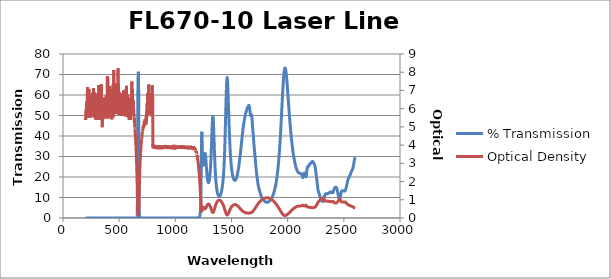
| Category | % Transmission |
|---|---|
| 2600.0 | 29.58 |
| 2599.0 | 29.379 |
| 2598.0 | 29.183 |
| 2597.0 | 28.99 |
| 2596.0 | 28.778 |
| 2595.0 | 28.524 |
| 2594.0 | 28.236 |
| 2593.0 | 27.945 |
| 2592.0 | 27.645 |
| 2591.0 | 27.343 |
| 2590.0 | 27.027 |
| 2589.0 | 26.702 |
| 2588.0 | 26.35 |
| 2587.0 | 26.017 |
| 2586.0 | 25.707 |
| 2585.0 | 25.427 |
| 2584.0 | 25.158 |
| 2583.0 | 24.856 |
| 2582.0 | 24.571 |
| 2581.0 | 24.337 |
| 2580.0 | 24.158 |
| 2579.0 | 24.025 |
| 2578.0 | 23.919 |
| 2577.0 | 23.807 |
| 2576.0 | 23.694 |
| 2575.0 | 23.592 |
| 2574.0 | 23.456 |
| 2573.0 | 23.315 |
| 2572.0 | 23.197 |
| 2571.0 | 23.062 |
| 2570.0 | 22.913 |
| 2569.0 | 22.806 |
| 2568.0 | 22.7 |
| 2567.0 | 22.589 |
| 2566.0 | 22.496 |
| 2565.0 | 22.359 |
| 2564.0 | 22.184 |
| 2563.0 | 22.007 |
| 2562.0 | 21.817 |
| 2561.0 | 21.641 |
| 2560.0 | 21.469 |
| 2559.0 | 21.308 |
| 2558.0 | 21.151 |
| 2557.0 | 21.07 |
| 2556.0 | 20.987 |
| 2555.0 | 20.881 |
| 2554.0 | 20.794 |
| 2553.0 | 20.704 |
| 2552.0 | 20.573 |
| 2551.0 | 20.452 |
| 2550.0 | 20.332 |
| 2549.0 | 20.199 |
| 2548.0 | 20.098 |
| 2547.0 | 19.998 |
| 2546.0 | 19.875 |
| 2545.0 | 19.773 |
| 2544.0 | 19.677 |
| 2543.0 | 19.545 |
| 2542.0 | 19.425 |
| 2541.0 | 19.298 |
| 2540.0 | 19.142 |
| 2539.0 | 18.992 |
| 2538.0 | 18.831 |
| 2537.0 | 18.654 |
| 2536.0 | 18.458 |
| 2535.0 | 18.24 |
| 2534.0 | 17.998 |
| 2533.0 | 17.746 |
| 2532.0 | 17.507 |
| 2531.0 | 17.247 |
| 2530.0 | 17.002 |
| 2529.0 | 16.762 |
| 2528.0 | 16.509 |
| 2527.0 | 16.263 |
| 2526.0 | 16.025 |
| 2525.0 | 15.786 |
| 2524.0 | 15.535 |
| 2523.0 | 15.297 |
| 2522.0 | 15.065 |
| 2521.0 | 14.838 |
| 2520.0 | 14.625 |
| 2519.0 | 14.425 |
| 2518.0 | 14.223 |
| 2517.0 | 14.029 |
| 2516.0 | 13.855 |
| 2515.0 | 13.69 |
| 2514.0 | 13.545 |
| 2513.0 | 13.435 |
| 2512.0 | 13.337 |
| 2511.0 | 13.264 |
| 2510.0 | 13.202 |
| 2509.0 | 13.159 |
| 2508.0 | 13.129 |
| 2507.0 | 13.104 |
| 2506.0 | 13.096 |
| 2505.0 | 13.101 |
| 2504.0 | 13.109 |
| 2503.0 | 13.13 |
| 2502.0 | 13.161 |
| 2501.0 | 13.182 |
| 2500.0 | 13.215 |
| 2499.0 | 13.241 |
| 2498.0 | 13.247 |
| 2497.0 | 13.269 |
| 2496.0 | 13.278 |
| 2495.0 | 13.264 |
| 2494.0 | 13.268 |
| 2493.0 | 13.266 |
| 2492.0 | 13.244 |
| 2491.0 | 13.25 |
| 2490.0 | 13.243 |
| 2489.0 | 13.227 |
| 2488.0 | 13.246 |
| 2487.0 | 13.242 |
| 2486.0 | 13.235 |
| 2485.0 | 13.254 |
| 2484.0 | 13.238 |
| 2483.0 | 13.199 |
| 2482.0 | 13.173 |
| 2481.0 | 13.08 |
| 2480.0 | 12.973 |
| 2479.0 | 12.864 |
| 2478.0 | 12.686 |
| 2477.0 | 12.497 |
| 2476.0 | 12.315 |
| 2475.0 | 12.071 |
| 2474.0 | 11.851 |
| 2473.0 | 11.625 |
| 2472.0 | 11.344 |
| 2471.0 | 11.096 |
| 2470.0 | 10.833 |
| 2469.0 | 10.531 |
| 2468.0 | 10.295 |
| 2467.0 | 10.043 |
| 2466.0 | 9.782 |
| 2465.0 | 9.595 |
| 2464.0 | 9.416 |
| 2463.0 | 9.266 |
| 2462.0 | 9.224 |
| 2461.0 | 9.194 |
| 2460.0 | 9.225 |
| 2459.0 | 9.349 |
| 2458.0 | 9.463 |
| 2457.0 | 9.645 |
| 2456.0 | 9.877 |
| 2455.0 | 10.051 |
| 2454.0 | 10.282 |
| 2453.0 | 10.539 |
| 2452.0 | 10.727 |
| 2451.0 | 11.004 |
| 2450.0 | 11.268 |
| 2449.0 | 11.489 |
| 2448.0 | 11.803 |
| 2447.0 | 12.069 |
| 2446.0 | 12.33 |
| 2445.0 | 12.666 |
| 2444.0 | 12.926 |
| 2443.0 | 13.196 |
| 2442.0 | 13.499 |
| 2441.0 | 13.686 |
| 2440.0 | 13.916 |
| 2439.0 | 14.151 |
| 2438.0 | 14.254 |
| 2437.0 | 14.449 |
| 2436.0 | 14.584 |
| 2435.0 | 14.624 |
| 2434.0 | 14.776 |
| 2433.0 | 14.825 |
| 2432.0 | 14.831 |
| 2431.0 | 14.947 |
| 2430.0 | 14.932 |
| 2429.0 | 14.95 |
| 2428.0 | 15.034 |
| 2427.0 | 14.968 |
| 2426.0 | 14.997 |
| 2425.0 | 15.025 |
| 2424.0 | 14.926 |
| 2423.0 | 14.956 |
| 2422.0 | 14.906 |
| 2421.0 | 14.799 |
| 2420.0 | 14.811 |
| 2419.0 | 14.7 |
| 2418.0 | 14.596 |
| 2417.0 | 14.566 |
| 2416.0 | 14.396 |
| 2415.0 | 14.302 |
| 2414.0 | 14.21 |
| 2413.0 | 14 |
| 2412.0 | 13.893 |
| 2411.0 | 13.72 |
| 2410.0 | 13.495 |
| 2409.0 | 13.386 |
| 2408.0 | 13.161 |
| 2407.0 | 12.971 |
| 2406.0 | 12.865 |
| 2405.0 | 12.651 |
| 2404.0 | 12.558 |
| 2403.0 | 12.481 |
| 2402.0 | 12.357 |
| 2401.0 | 12.365 |
| 2400.0 | 12.332 |
| 2399.0 | 12.295 |
| 2398.0 | 12.364 |
| 2397.0 | 12.34 |
| 2396.0 | 12.369 |
| 2395.0 | 12.434 |
| 2394.0 | 12.403 |
| 2393.0 | 12.463 |
| 2392.0 | 12.484 |
| 2391.0 | 12.47 |
| 2390.0 | 12.54 |
| 2389.0 | 12.528 |
| 2388.0 | 12.545 |
| 2387.0 | 12.614 |
| 2386.0 | 12.595 |
| 2385.0 | 12.657 |
| 2384.0 | 12.687 |
| 2383.0 | 12.674 |
| 2382.0 | 12.744 |
| 2381.0 | 12.726 |
| 2380.0 | 12.722 |
| 2379.0 | 12.749 |
| 2378.0 | 12.68 |
| 2377.0 | 12.673 |
| 2376.0 | 12.631 |
| 2375.0 | 12.545 |
| 2374.0 | 12.532 |
| 2373.0 | 12.446 |
| 2372.0 | 12.38 |
| 2371.0 | 12.352 |
| 2370.0 | 12.259 |
| 2369.0 | 12.23 |
| 2368.0 | 12.177 |
| 2367.0 | 12.103 |
| 2366.0 | 12.097 |
| 2365.0 | 12.037 |
| 2364.0 | 12.021 |
| 2363.0 | 12.029 |
| 2362.0 | 12.003 |
| 2361.0 | 12.036 |
| 2360.0 | 12.032 |
| 2359.0 | 12.02 |
| 2358.0 | 12.04 |
| 2357.0 | 11.988 |
| 2356.0 | 11.971 |
| 2355.0 | 11.938 |
| 2354.0 | 11.861 |
| 2353.0 | 11.845 |
| 2352.0 | 11.785 |
| 2351.0 | 11.758 |
| 2350.0 | 11.768 |
| 2349.0 | 11.74 |
| 2348.0 | 11.777 |
| 2347.0 | 11.793 |
| 2346.0 | 11.804 |
| 2345.0 | 11.857 |
| 2344.0 | 11.849 |
| 2343.0 | 11.878 |
| 2342.0 | 11.889 |
| 2341.0 | 11.857 |
| 2340.0 | 11.875 |
| 2339.0 | 11.81 |
| 2338.0 | 11.77 |
| 2337.0 | 11.729 |
| 2336.0 | 11.616 |
| 2335.0 | 11.564 |
| 2334.0 | 11.434 |
| 2333.0 | 11.307 |
| 2332.0 | 11.216 |
| 2331.0 | 11.033 |
| 2330.0 | 10.925 |
| 2329.0 | 10.767 |
| 2328.0 | 10.589 |
| 2327.0 | 10.459 |
| 2326.0 | 10.239 |
| 2325.0 | 10.068 |
| 2324.0 | 9.864 |
| 2323.0 | 9.6 |
| 2322.0 | 9.405 |
| 2321.0 | 9.104 |
| 2320.0 | 8.871 |
| 2319.0 | 8.654 |
| 2318.0 | 8.404 |
| 2317.0 | 8.287 |
| 2316.0 | 8.129 |
| 2315.0 | 8.051 |
| 2314.0 | 8.036 |
| 2313.0 | 7.991 |
| 2312.0 | 8.062 |
| 2311.0 | 8.076 |
| 2310.0 | 8.129 |
| 2309.0 | 8.218 |
| 2308.0 | 8.235 |
| 2307.0 | 8.325 |
| 2306.0 | 8.347 |
| 2305.0 | 8.384 |
| 2304.0 | 8.449 |
| 2303.0 | 8.457 |
| 2302.0 | 8.539 |
| 2301.0 | 8.592 |
| 2300.0 | 8.661 |
| 2299.0 | 8.773 |
| 2298.0 | 8.863 |
| 2297.0 | 8.999 |
| 2296.0 | 9.125 |
| 2295.0 | 9.265 |
| 2294.0 | 9.418 |
| 2293.0 | 9.566 |
| 2292.0 | 9.726 |
| 2291.0 | 9.889 |
| 2290.0 | 10.055 |
| 2289.0 | 10.24 |
| 2288.0 | 10.425 |
| 2287.0 | 10.612 |
| 2286.0 | 10.807 |
| 2285.0 | 11.007 |
| 2284.0 | 11.198 |
| 2283.0 | 11.392 |
| 2282.0 | 11.583 |
| 2281.0 | 11.737 |
| 2280.0 | 11.899 |
| 2279.0 | 12.035 |
| 2278.0 | 12.156 |
| 2277.0 | 12.3 |
| 2276.0 | 12.413 |
| 2275.0 | 12.583 |
| 2274.0 | 12.741 |
| 2273.0 | 12.949 |
| 2272.0 | 13.212 |
| 2271.0 | 13.476 |
| 2270.0 | 13.857 |
| 2269.0 | 14.218 |
| 2268.0 | 14.633 |
| 2267.0 | 15.074 |
| 2266.0 | 15.491 |
| 2265.0 | 15.971 |
| 2264.0 | 16.408 |
| 2263.0 | 16.91 |
| 2262.0 | 17.372 |
| 2261.0 | 17.826 |
| 2260.0 | 18.316 |
| 2259.0 | 18.766 |
| 2258.0 | 19.248 |
| 2257.0 | 19.728 |
| 2256.0 | 20.213 |
| 2255.0 | 20.685 |
| 2254.0 | 21.143 |
| 2253.0 | 21.618 |
| 2252.0 | 22.054 |
| 2251.0 | 22.505 |
| 2250.0 | 22.939 |
| 2249.0 | 23.334 |
| 2248.0 | 23.718 |
| 2247.0 | 24.073 |
| 2246.0 | 24.41 |
| 2245.0 | 24.711 |
| 2244.0 | 25.001 |
| 2243.0 | 25.26 |
| 2242.0 | 25.484 |
| 2241.0 | 25.685 |
| 2240.0 | 25.863 |
| 2239.0 | 26.015 |
| 2238.0 | 26.154 |
| 2237.0 | 26.274 |
| 2236.0 | 26.369 |
| 2235.0 | 26.468 |
| 2234.0 | 26.553 |
| 2233.0 | 26.641 |
| 2232.0 | 26.729 |
| 2231.0 | 26.827 |
| 2230.0 | 26.928 |
| 2229.0 | 27.03 |
| 2228.0 | 27.136 |
| 2227.0 | 27.235 |
| 2226.0 | 27.332 |
| 2225.0 | 27.412 |
| 2224.0 | 27.484 |
| 2223.0 | 27.532 |
| 2222.0 | 27.566 |
| 2221.0 | 27.571 |
| 2220.0 | 27.566 |
| 2219.0 | 27.538 |
| 2218.0 | 27.493 |
| 2217.0 | 27.439 |
| 2216.0 | 27.373 |
| 2215.0 | 27.309 |
| 2214.0 | 27.22 |
| 2213.0 | 27.163 |
| 2212.0 | 27.077 |
| 2211.0 | 27.016 |
| 2210.0 | 26.955 |
| 2209.0 | 26.896 |
| 2208.0 | 26.859 |
| 2207.0 | 26.798 |
| 2206.0 | 26.782 |
| 2205.0 | 26.722 |
| 2204.0 | 26.708 |
| 2203.0 | 26.663 |
| 2202.0 | 26.626 |
| 2201.0 | 26.588 |
| 2200.0 | 26.519 |
| 2199.0 | 26.477 |
| 2198.0 | 26.368 |
| 2197.0 | 26.314 |
| 2196.0 | 26.18 |
| 2195.0 | 26.086 |
| 2194.0 | 25.951 |
| 2193.0 | 25.817 |
| 2192.0 | 25.703 |
| 2191.0 | 25.562 |
| 2190.0 | 25.497 |
| 2189.0 | 25.381 |
| 2188.0 | 25.356 |
| 2187.0 | 25.305 |
| 2186.0 | 25.302 |
| 2185.0 | 25.3 |
| 2184.0 | 25.299 |
| 2183.0 | 25.313 |
| 2182.0 | 25.288 |
| 2181.0 | 25.275 |
| 2180.0 | 25.218 |
| 2179.0 | 25.148 |
| 2178.0 | 25.04 |
| 2177.0 | 24.901 |
| 2176.0 | 24.728 |
| 2175.0 | 24.514 |
| 2174.0 | 24.252 |
| 2173.0 | 23.929 |
| 2172.0 | 23.564 |
| 2171.0 | 23.152 |
| 2170.0 | 22.693 |
| 2169.0 | 22.205 |
| 2168.0 | 21.725 |
| 2167.0 | 21.251 |
| 2166.0 | 20.824 |
| 2165.0 | 20.5 |
| 2164.0 | 20.255 |
| 2163.0 | 20.11 |
| 2162.0 | 20.067 |
| 2161.0 | 20.11 |
| 2160.0 | 20.243 |
| 2159.0 | 20.42 |
| 2158.0 | 20.63 |
| 2157.0 | 20.865 |
| 2156.0 | 21.101 |
| 2155.0 | 21.32 |
| 2154.0 | 21.528 |
| 2153.0 | 21.691 |
| 2152.0 | 21.819 |
| 2151.0 | 21.903 |
| 2150.0 | 21.945 |
| 2149.0 | 21.947 |
| 2148.0 | 21.896 |
| 2147.0 | 21.812 |
| 2146.0 | 21.684 |
| 2145.0 | 21.516 |
| 2144.0 | 21.325 |
| 2143.0 | 21.1 |
| 2142.0 | 20.865 |
| 2141.0 | 20.604 |
| 2140.0 | 20.355 |
| 2139.0 | 20.138 |
| 2138.0 | 19.944 |
| 2137.0 | 19.799 |
| 2136.0 | 19.724 |
| 2135.0 | 19.717 |
| 2134.0 | 19.788 |
| 2133.0 | 19.922 |
| 2132.0 | 20.105 |
| 2131.0 | 20.325 |
| 2130.0 | 20.554 |
| 2129.0 | 20.775 |
| 2128.0 | 20.976 |
| 2127.0 | 21.146 |
| 2126.0 | 21.277 |
| 2125.0 | 21.369 |
| 2124.0 | 21.442 |
| 2123.0 | 21.486 |
| 2122.0 | 21.517 |
| 2121.0 | 21.544 |
| 2120.0 | 21.566 |
| 2119.0 | 21.596 |
| 2118.0 | 21.615 |
| 2117.0 | 21.643 |
| 2116.0 | 21.666 |
| 2115.0 | 21.694 |
| 2114.0 | 21.711 |
| 2113.0 | 21.731 |
| 2112.0 | 21.744 |
| 2111.0 | 21.763 |
| 2110.0 | 21.78 |
| 2109.0 | 21.799 |
| 2108.0 | 21.822 |
| 2107.0 | 21.844 |
| 2106.0 | 21.867 |
| 2105.0 | 21.893 |
| 2104.0 | 21.917 |
| 2103.0 | 21.947 |
| 2102.0 | 21.974 |
| 2101.0 | 22.002 |
| 2100.0 | 22.034 |
| 2099.0 | 22.069 |
| 2098.0 | 22.107 |
| 2097.0 | 22.147 |
| 2096.0 | 22.194 |
| 2095.0 | 22.248 |
| 2094.0 | 22.302 |
| 2093.0 | 22.362 |
| 2092.0 | 22.426 |
| 2091.0 | 22.495 |
| 2090.0 | 22.576 |
| 2089.0 | 22.66 |
| 2088.0 | 22.748 |
| 2087.0 | 22.843 |
| 2086.0 | 22.945 |
| 2085.0 | 23.056 |
| 2084.0 | 23.175 |
| 2083.0 | 23.301 |
| 2082.0 | 23.438 |
| 2081.0 | 23.574 |
| 2080.0 | 23.725 |
| 2079.0 | 23.882 |
| 2078.0 | 24.043 |
| 2077.0 | 24.22 |
| 2076.0 | 24.406 |
| 2075.0 | 24.587 |
| 2074.0 | 24.782 |
| 2073.0 | 24.982 |
| 2072.0 | 25.189 |
| 2071.0 | 25.403 |
| 2070.0 | 25.632 |
| 2069.0 | 25.862 |
| 2068.0 | 26.088 |
| 2067.0 | 26.331 |
| 2066.0 | 26.579 |
| 2065.0 | 26.824 |
| 2064.0 | 27.098 |
| 2063.0 | 27.367 |
| 2062.0 | 27.634 |
| 2061.0 | 27.909 |
| 2060.0 | 28.197 |
| 2059.0 | 28.477 |
| 2058.0 | 28.782 |
| 2057.0 | 29.093 |
| 2056.0 | 29.4 |
| 2055.0 | 29.709 |
| 2054.0 | 30.031 |
| 2053.0 | 30.364 |
| 2052.0 | 30.7 |
| 2051.0 | 31.057 |
| 2050.0 | 31.428 |
| 2049.0 | 31.78 |
| 2048.0 | 32.163 |
| 2047.0 | 32.543 |
| 2046.0 | 32.93 |
| 2045.0 | 33.341 |
| 2044.0 | 33.767 |
| 2043.0 | 34.193 |
| 2042.0 | 34.619 |
| 2041.0 | 35.062 |
| 2040.0 | 35.522 |
| 2039.0 | 35.989 |
| 2038.0 | 36.484 |
| 2037.0 | 36.981 |
| 2036.0 | 37.479 |
| 2035.0 | 37.987 |
| 2034.0 | 38.519 |
| 2033.0 | 39.05 |
| 2032.0 | 39.613 |
| 2031.0 | 40.181 |
| 2030.0 | 40.736 |
| 2029.0 | 41.313 |
| 2028.0 | 41.893 |
| 2027.0 | 42.488 |
| 2026.0 | 43.101 |
| 2025.0 | 43.726 |
| 2024.0 | 44.365 |
| 2023.0 | 44.972 |
| 2022.0 | 45.626 |
| 2021.0 | 46.265 |
| 2020.0 | 46.926 |
| 2019.0 | 47.604 |
| 2018.0 | 48.296 |
| 2017.0 | 48.973 |
| 2016.0 | 49.664 |
| 2015.0 | 50.378 |
| 2014.0 | 51.082 |
| 2013.0 | 51.823 |
| 2012.0 | 52.583 |
| 2011.0 | 53.322 |
| 2010.0 | 54.077 |
| 2009.0 | 54.83 |
| 2008.0 | 55.605 |
| 2007.0 | 56.371 |
| 2006.0 | 57.178 |
| 2005.0 | 57.975 |
| 2004.0 | 58.749 |
| 2003.0 | 59.527 |
| 2002.0 | 60.309 |
| 2001.0 | 61.057 |
| 2000.0 | 61.853 |
| 1999.0 | 62.61 |
| 1998.0 | 63.377 |
| 1997.0 | 64.103 |
| 1996.0 | 64.838 |
| 1995.0 | 65.545 |
| 1994.0 | 66.245 |
| 1993.0 | 66.949 |
| 1992.0 | 67.612 |
| 1991.0 | 68.251 |
| 1990.0 | 68.865 |
| 1989.0 | 69.451 |
| 1988.0 | 69.986 |
| 1987.0 | 70.53 |
| 1986.0 | 71.016 |
| 1985.0 | 71.437 |
| 1984.0 | 71.839 |
| 1983.0 | 72.171 |
| 1982.0 | 72.473 |
| 1981.0 | 72.732 |
| 1980.0 | 72.926 |
| 1979.0 | 73.088 |
| 1978.0 | 73.164 |
| 1977.0 | 73.227 |
| 1976.0 | 73.19 |
| 1975.0 | 73.134 |
| 1974.0 | 72.991 |
| 1973.0 | 72.804 |
| 1972.0 | 72.55 |
| 1971.0 | 72.258 |
| 1970.0 | 71.889 |
| 1969.0 | 71.492 |
| 1968.0 | 71.016 |
| 1967.0 | 70.476 |
| 1966.0 | 69.924 |
| 1965.0 | 69.288 |
| 1964.0 | 68.644 |
| 1963.0 | 67.898 |
| 1962.0 | 67.173 |
| 1961.0 | 66.306 |
| 1960.0 | 65.463 |
| 1959.0 | 64.599 |
| 1958.0 | 63.686 |
| 1957.0 | 62.742 |
| 1956.0 | 61.776 |
| 1955.0 | 60.773 |
| 1954.0 | 59.713 |
| 1953.0 | 58.688 |
| 1952.0 | 57.636 |
| 1951.0 | 56.591 |
| 1950.0 | 55.525 |
| 1949.0 | 54.458 |
| 1948.0 | 53.33 |
| 1947.0 | 52.238 |
| 1946.0 | 51.172 |
| 1945.0 | 50.076 |
| 1944.0 | 48.991 |
| 1943.0 | 47.926 |
| 1942.0 | 46.864 |
| 1941.0 | 45.801 |
| 1940.0 | 44.791 |
| 1939.0 | 43.737 |
| 1938.0 | 42.739 |
| 1937.0 | 41.752 |
| 1936.0 | 40.781 |
| 1935.0 | 39.81 |
| 1934.0 | 38.841 |
| 1933.0 | 37.963 |
| 1932.0 | 37.062 |
| 1931.0 | 36.201 |
| 1930.0 | 35.347 |
| 1929.0 | 34.465 |
| 1928.0 | 33.62 |
| 1927.0 | 32.816 |
| 1926.0 | 32.093 |
| 1925.0 | 31.378 |
| 1924.0 | 30.666 |
| 1923.0 | 29.965 |
| 1922.0 | 29.295 |
| 1921.0 | 28.635 |
| 1920.0 | 27.901 |
| 1919.0 | 27.192 |
| 1918.0 | 26.567 |
| 1917.0 | 26.025 |
| 1916.0 | 25.469 |
| 1915.0 | 24.901 |
| 1914.0 | 24.372 |
| 1913.0 | 23.817 |
| 1912.0 | 23.271 |
| 1911.0 | 22.751 |
| 1910.0 | 22.257 |
| 1909.0 | 21.815 |
| 1908.0 | 21.414 |
| 1907.0 | 21.019 |
| 1906.0 | 20.552 |
| 1905.0 | 20.113 |
| 1904.0 | 19.662 |
| 1903.0 | 19.263 |
| 1902.0 | 18.911 |
| 1901.0 | 18.563 |
| 1900.0 | 18.208 |
| 1899.0 | 17.843 |
| 1898.0 | 17.488 |
| 1897.0 | 17.16 |
| 1896.0 | 16.873 |
| 1895.0 | 16.6 |
| 1894.0 | 16.317 |
| 1893.0 | 16.019 |
| 1892.0 | 15.75 |
| 1891.0 | 15.471 |
| 1890.0 | 15.204 |
| 1889.0 | 14.943 |
| 1888.0 | 14.707 |
| 1887.0 | 14.472 |
| 1886.0 | 14.236 |
| 1885.0 | 13.999 |
| 1884.0 | 13.753 |
| 1883.0 | 13.528 |
| 1882.0 | 13.324 |
| 1881.0 | 13.125 |
| 1880.0 | 12.922 |
| 1879.0 | 12.737 |
| 1878.0 | 12.541 |
| 1877.0 | 12.35 |
| 1876.0 | 12.161 |
| 1875.0 | 11.996 |
| 1874.0 | 11.837 |
| 1873.0 | 11.687 |
| 1872.0 | 11.515 |
| 1871.0 | 11.34 |
| 1870.0 | 11.193 |
| 1869.0 | 11.052 |
| 1868.0 | 10.901 |
| 1867.0 | 10.759 |
| 1866.0 | 10.629 |
| 1865.0 | 10.507 |
| 1864.0 | 10.383 |
| 1863.0 | 10.259 |
| 1862.0 | 10.153 |
| 1861.0 | 10.048 |
| 1860.0 | 9.931 |
| 1859.0 | 9.82 |
| 1858.0 | 9.711 |
| 1857.0 | 9.617 |
| 1856.0 | 9.52 |
| 1855.0 | 9.42 |
| 1854.0 | 9.323 |
| 1853.0 | 9.223 |
| 1852.0 | 9.134 |
| 1851.0 | 9.055 |
| 1850.0 | 8.987 |
| 1849.0 | 8.92 |
| 1848.0 | 8.839 |
| 1847.0 | 8.751 |
| 1846.0 | 8.671 |
| 1845.0 | 8.606 |
| 1844.0 | 8.551 |
| 1843.0 | 8.496 |
| 1842.0 | 8.434 |
| 1841.0 | 8.365 |
| 1840.0 | 8.302 |
| 1839.0 | 8.247 |
| 1838.0 | 8.204 |
| 1837.0 | 8.159 |
| 1836.0 | 8.107 |
| 1835.0 | 8.061 |
| 1834.0 | 8.022 |
| 1833.0 | 7.99 |
| 1832.0 | 7.958 |
| 1831.0 | 7.922 |
| 1830.0 | 7.885 |
| 1829.0 | 7.845 |
| 1828.0 | 7.826 |
| 1827.0 | 7.804 |
| 1826.0 | 7.79 |
| 1825.0 | 7.767 |
| 1824.0 | 7.748 |
| 1823.0 | 7.73 |
| 1822.0 | 7.719 |
| 1821.0 | 7.71 |
| 1820.0 | 7.701 |
| 1819.0 | 7.704 |
| 1818.0 | 7.696 |
| 1817.0 | 7.698 |
| 1816.0 | 7.698 |
| 1815.0 | 7.695 |
| 1814.0 | 7.703 |
| 1813.0 | 7.705 |
| 1812.0 | 7.708 |
| 1811.0 | 7.725 |
| 1810.0 | 7.738 |
| 1809.0 | 7.752 |
| 1808.0 | 7.77 |
| 1807.0 | 7.787 |
| 1806.0 | 7.812 |
| 1805.0 | 7.834 |
| 1804.0 | 7.854 |
| 1803.0 | 7.884 |
| 1802.0 | 7.912 |
| 1801.0 | 7.94 |
| 1800.0 | 7.978 |
| 1799.0 | 8.01 |
| 1798.0 | 8.044 |
| 1797.0 | 8.087 |
| 1796.0 | 8.127 |
| 1795.0 | 8.167 |
| 1794.0 | 8.219 |
| 1793.0 | 8.264 |
| 1792.0 | 8.307 |
| 1791.0 | 8.366 |
| 1790.0 | 8.417 |
| 1789.0 | 8.47 |
| 1788.0 | 8.534 |
| 1787.0 | 8.593 |
| 1786.0 | 8.652 |
| 1785.0 | 8.723 |
| 1784.0 | 8.788 |
| 1783.0 | 8.851 |
| 1782.0 | 8.931 |
| 1781.0 | 8.999 |
| 1780.0 | 9.071 |
| 1779.0 | 9.146 |
| 1778.0 | 9.217 |
| 1777.0 | 9.292 |
| 1776.0 | 9.376 |
| 1775.0 | 9.456 |
| 1774.0 | 9.541 |
| 1773.0 | 9.632 |
| 1772.0 | 9.722 |
| 1771.0 | 9.816 |
| 1770.0 | 9.927 |
| 1769.0 | 10.042 |
| 1768.0 | 10.162 |
| 1767.0 | 10.298 |
| 1766.0 | 10.433 |
| 1765.0 | 10.573 |
| 1764.0 | 10.728 |
| 1763.0 | 10.885 |
| 1762.0 | 11.048 |
| 1761.0 | 11.216 |
| 1760.0 | 11.384 |
| 1759.0 | 11.556 |
| 1758.0 | 11.733 |
| 1757.0 | 11.913 |
| 1756.0 | 12.092 |
| 1755.0 | 12.274 |
| 1754.0 | 12.462 |
| 1753.0 | 12.639 |
| 1752.0 | 12.82 |
| 1751.0 | 13.015 |
| 1750.0 | 13.212 |
| 1749.0 | 13.408 |
| 1748.0 | 13.618 |
| 1747.0 | 13.822 |
| 1746.0 | 14.027 |
| 1745.0 | 14.241 |
| 1744.0 | 14.457 |
| 1743.0 | 14.677 |
| 1742.0 | 14.907 |
| 1741.0 | 15.146 |
| 1740.0 | 15.402 |
| 1739.0 | 15.666 |
| 1738.0 | 15.954 |
| 1737.0 | 16.262 |
| 1736.0 | 16.581 |
| 1735.0 | 16.916 |
| 1734.0 | 17.265 |
| 1733.0 | 17.631 |
| 1732.0 | 18.012 |
| 1731.0 | 18.416 |
| 1730.0 | 18.838 |
| 1729.0 | 19.25 |
| 1728.0 | 19.675 |
| 1727.0 | 20.104 |
| 1726.0 | 20.531 |
| 1725.0 | 20.964 |
| 1724.0 | 21.438 |
| 1723.0 | 21.922 |
| 1722.0 | 22.393 |
| 1721.0 | 22.926 |
| 1720.0 | 23.472 |
| 1719.0 | 24.038 |
| 1718.0 | 24.641 |
| 1717.0 | 25.28 |
| 1716.0 | 25.915 |
| 1715.0 | 26.537 |
| 1714.0 | 27.187 |
| 1713.0 | 27.817 |
| 1712.0 | 28.435 |
| 1711.0 | 29.07 |
| 1710.0 | 29.685 |
| 1709.0 | 30.277 |
| 1708.0 | 30.863 |
| 1707.0 | 31.459 |
| 1706.0 | 32.034 |
| 1705.0 | 32.639 |
| 1704.0 | 33.242 |
| 1703.0 | 33.812 |
| 1702.0 | 34.402 |
| 1701.0 | 35.013 |
| 1700.0 | 35.682 |
| 1699.0 | 36.394 |
| 1698.0 | 37.205 |
| 1697.0 | 38.061 |
| 1696.0 | 38.869 |
| 1695.0 | 39.673 |
| 1694.0 | 40.442 |
| 1693.0 | 41.127 |
| 1692.0 | 41.762 |
| 1691.0 | 42.333 |
| 1690.0 | 42.913 |
| 1689.0 | 43.515 |
| 1688.0 | 44.151 |
| 1687.0 | 44.859 |
| 1686.0 | 45.656 |
| 1685.0 | 46.497 |
| 1684.0 | 47.27 |
| 1683.0 | 48.017 |
| 1682.0 | 48.725 |
| 1681.0 | 49.32 |
| 1680.0 | 49.736 |
| 1679.0 | 50.06 |
| 1678.0 | 50.286 |
| 1677.0 | 50.379 |
| 1676.0 | 50.327 |
| 1675.0 | 50.243 |
| 1674.0 | 50.177 |
| 1673.0 | 50.091 |
| 1672.0 | 49.978 |
| 1671.0 | 49.927 |
| 1670.0 | 50.02 |
| 1669.0 | 50.199 |
| 1668.0 | 50.415 |
| 1667.0 | 50.776 |
| 1666.0 | 51.315 |
| 1665.0 | 51.908 |
| 1664.0 | 52.417 |
| 1663.0 | 52.909 |
| 1662.0 | 53.44 |
| 1661.0 | 53.908 |
| 1660.0 | 54.246 |
| 1659.0 | 54.463 |
| 1658.0 | 54.665 |
| 1657.0 | 54.872 |
| 1656.0 | 54.96 |
| 1655.0 | 54.924 |
| 1654.0 | 54.888 |
| 1653.0 | 54.891 |
| 1652.0 | 54.849 |
| 1651.0 | 54.678 |
| 1650.0 | 54.47 |
| 1649.0 | 54.362 |
| 1648.0 | 54.291 |
| 1647.0 | 54.172 |
| 1646.0 | 54.011 |
| 1645.0 | 53.923 |
| 1644.0 | 53.934 |
| 1643.0 | 53.932 |
| 1642.0 | 53.805 |
| 1641.0 | 53.647 |
| 1640.0 | 53.528 |
| 1639.0 | 53.464 |
| 1638.0 | 53.308 |
| 1637.0 | 53.048 |
| 1636.0 | 52.805 |
| 1635.0 | 52.667 |
| 1634.0 | 52.54 |
| 1633.0 | 52.359 |
| 1632.0 | 52.107 |
| 1631.0 | 51.892 |
| 1630.0 | 51.766 |
| 1629.0 | 51.66 |
| 1628.0 | 51.437 |
| 1627.0 | 51.147 |
| 1626.0 | 50.889 |
| 1625.0 | 50.721 |
| 1624.0 | 50.532 |
| 1623.0 | 50.255 |
| 1622.0 | 49.909 |
| 1621.0 | 49.592 |
| 1620.0 | 49.364 |
| 1619.0 | 49.157 |
| 1618.0 | 48.875 |
| 1617.0 | 48.533 |
| 1616.0 | 48.211 |
| 1615.0 | 47.95 |
| 1614.0 | 47.714 |
| 1613.0 | 47.444 |
| 1612.0 | 47.057 |
| 1611.0 | 46.664 |
| 1610.0 | 46.325 |
| 1609.0 | 46.012 |
| 1608.0 | 45.677 |
| 1607.0 | 45.263 |
| 1606.0 | 44.796 |
| 1605.0 | 44.362 |
| 1604.0 | 43.987 |
| 1603.0 | 43.611 |
| 1602.0 | 43.175 |
| 1601.0 | 42.673 |
| 1600.0 | 42.157 |
| 1599.0 | 41.685 |
| 1598.0 | 41.249 |
| 1597.0 | 40.823 |
| 1596.0 | 40.295 |
| 1595.0 | 39.743 |
| 1594.0 | 39.195 |
| 1593.0 | 38.683 |
| 1592.0 | 38.207 |
| 1591.0 | 37.699 |
| 1590.0 | 37.163 |
| 1589.0 | 36.587 |
| 1588.0 | 36.012 |
| 1587.0 | 35.497 |
| 1586.0 | 35.003 |
| 1585.0 | 34.52 |
| 1584.0 | 34.004 |
| 1583.0 | 33.455 |
| 1582.0 | 32.915 |
| 1581.0 | 32.406 |
| 1580.0 | 31.928 |
| 1579.0 | 31.473 |
| 1578.0 | 31.016 |
| 1577.0 | 30.509 |
| 1576.0 | 30 |
| 1575.0 | 29.512 |
| 1574.0 | 29.049 |
| 1573.0 | 28.616 |
| 1572.0 | 28.193 |
| 1571.0 | 27.767 |
| 1570.0 | 27.313 |
| 1569.0 | 26.872 |
| 1568.0 | 26.452 |
| 1567.0 | 26.044 |
| 1566.0 | 25.67 |
| 1565.0 | 25.318 |
| 1564.0 | 24.946 |
| 1563.0 | 24.576 |
| 1562.0 | 24.215 |
| 1561.0 | 23.863 |
| 1560.0 | 23.52 |
| 1559.0 | 23.212 |
| 1558.0 | 22.907 |
| 1557.0 | 22.603 |
| 1556.0 | 22.32 |
| 1555.0 | 22.02 |
| 1554.0 | 21.733 |
| 1553.0 | 21.451 |
| 1552.0 | 21.191 |
| 1551.0 | 20.939 |
| 1550.0 | 20.698 |
| 1549.0 | 20.493 |
| 1548.0 | 20.273 |
| 1547.0 | 20.063 |
| 1546.0 | 19.859 |
| 1545.0 | 19.664 |
| 1544.0 | 19.491 |
| 1543.0 | 19.338 |
| 1542.0 | 19.205 |
| 1541.0 | 19.077 |
| 1540.0 | 18.965 |
| 1539.0 | 18.853 |
| 1538.0 | 18.748 |
| 1537.0 | 18.65 |
| 1536.0 | 18.564 |
| 1535.0 | 18.496 |
| 1534.0 | 18.446 |
| 1533.0 | 18.415 |
| 1532.0 | 18.394 |
| 1531.0 | 18.385 |
| 1530.0 | 18.389 |
| 1529.0 | 18.398 |
| 1528.0 | 18.412 |
| 1527.0 | 18.436 |
| 1526.0 | 18.467 |
| 1525.0 | 18.514 |
| 1524.0 | 18.574 |
| 1523.0 | 18.645 |
| 1522.0 | 18.734 |
| 1521.0 | 18.835 |
| 1520.0 | 18.946 |
| 1519.0 | 19.075 |
| 1518.0 | 19.213 |
| 1517.0 | 19.361 |
| 1516.0 | 19.518 |
| 1515.0 | 19.69 |
| 1514.0 | 19.875 |
| 1513.0 | 20.088 |
| 1512.0 | 20.312 |
| 1511.0 | 20.545 |
| 1510.0 | 20.799 |
| 1509.0 | 21.075 |
| 1508.0 | 21.369 |
| 1507.0 | 21.683 |
| 1506.0 | 22.028 |
| 1505.0 | 22.39 |
| 1504.0 | 22.753 |
| 1503.0 | 23.155 |
| 1502.0 | 23.582 |
| 1501.0 | 24.028 |
| 1500.0 | 24.521 |
| 1499.0 | 25.036 |
| 1498.0 | 25.575 |
| 1497.0 | 26.148 |
| 1496.0 | 26.769 |
| 1495.0 | 27.403 |
| 1494.0 | 28.103 |
| 1493.0 | 28.843 |
| 1492.0 | 29.599 |
| 1491.0 | 30.417 |
| 1490.0 | 31.281 |
| 1489.0 | 32.202 |
| 1488.0 | 33.165 |
| 1487.0 | 34.225 |
| 1486.0 | 35.337 |
| 1485.0 | 36.45 |
| 1484.0 | 37.674 |
| 1483.0 | 38.928 |
| 1482.0 | 40.241 |
| 1481.0 | 41.668 |
| 1480.0 | 43.16 |
| 1479.0 | 44.662 |
| 1478.0 | 46.217 |
| 1477.0 | 47.837 |
| 1476.0 | 49.5 |
| 1475.0 | 51.222 |
| 1474.0 | 53.006 |
| 1473.0 | 54.732 |
| 1472.0 | 56.489 |
| 1471.0 | 58.185 |
| 1470.0 | 59.872 |
| 1469.0 | 61.451 |
| 1468.0 | 62.996 |
| 1467.0 | 64.406 |
| 1466.0 | 65.599 |
| 1465.0 | 66.656 |
| 1464.0 | 67.492 |
| 1463.0 | 68.083 |
| 1462.0 | 68.446 |
| 1461.0 | 68.531 |
| 1460.0 | 68.328 |
| 1459.0 | 67.876 |
| 1458.0 | 67.145 |
| 1457.0 | 66.161 |
| 1456.0 | 64.924 |
| 1455.0 | 63.409 |
| 1454.0 | 61.76 |
| 1453.0 | 60.003 |
| 1452.0 | 58.091 |
| 1451.0 | 56.092 |
| 1450.0 | 54.044 |
| 1449.0 | 51.877 |
| 1448.0 | 49.729 |
| 1447.0 | 47.692 |
| 1446.0 | 45.635 |
| 1445.0 | 43.573 |
| 1444.0 | 41.619 |
| 1443.0 | 39.723 |
| 1442.0 | 37.838 |
| 1441.0 | 36.053 |
| 1440.0 | 34.451 |
| 1439.0 | 32.844 |
| 1438.0 | 31.374 |
| 1437.0 | 29.944 |
| 1436.0 | 28.572 |
| 1435.0 | 27.309 |
| 1434.0 | 26.136 |
| 1433.0 | 25.032 |
| 1432.0 | 23.99 |
| 1431.0 | 23.027 |
| 1430.0 | 22.113 |
| 1429.0 | 21.255 |
| 1428.0 | 20.501 |
| 1427.0 | 19.765 |
| 1426.0 | 19.112 |
| 1425.0 | 18.494 |
| 1424.0 | 17.929 |
| 1423.0 | 17.382 |
| 1422.0 | 16.89 |
| 1421.0 | 16.452 |
| 1420.0 | 16.028 |
| 1419.0 | 15.618 |
| 1418.0 | 15.236 |
| 1417.0 | 14.874 |
| 1416.0 | 14.529 |
| 1415.0 | 14.218 |
| 1414.0 | 13.9 |
| 1413.0 | 13.603 |
| 1412.0 | 13.335 |
| 1411.0 | 13.063 |
| 1410.0 | 12.815 |
| 1409.0 | 12.569 |
| 1408.0 | 12.352 |
| 1407.0 | 12.149 |
| 1406.0 | 11.946 |
| 1405.0 | 11.772 |
| 1404.0 | 11.584 |
| 1403.0 | 11.441 |
| 1402.0 | 11.313 |
| 1401.0 | 11.197 |
| 1400.0 | 11.072 |
| 1399.0 | 10.955 |
| 1398.0 | 10.857 |
| 1397.0 | 10.774 |
| 1396.0 | 10.693 |
| 1395.0 | 10.62 |
| 1394.0 | 10.574 |
| 1393.0 | 10.548 |
| 1392.0 | 10.529 |
| 1391.0 | 10.516 |
| 1390.0 | 10.521 |
| 1389.0 | 10.541 |
| 1388.0 | 10.573 |
| 1387.0 | 10.624 |
| 1386.0 | 10.67 |
| 1385.0 | 10.742 |
| 1384.0 | 10.809 |
| 1383.0 | 10.88 |
| 1382.0 | 11.005 |
| 1381.0 | 11.105 |
| 1380.0 | 11.238 |
| 1379.0 | 11.37 |
| 1378.0 | 11.53 |
| 1377.0 | 11.706 |
| 1376.0 | 11.906 |
| 1375.0 | 12.124 |
| 1374.0 | 12.381 |
| 1373.0 | 12.654 |
| 1372.0 | 12.957 |
| 1371.0 | 13.305 |
| 1370.0 | 13.68 |
| 1369.0 | 14.024 |
| 1368.0 | 14.392 |
| 1367.0 | 14.848 |
| 1366.0 | 15.31 |
| 1365.0 | 15.819 |
| 1364.0 | 16.377 |
| 1363.0 | 16.884 |
| 1362.0 | 17.465 |
| 1361.0 | 18.22 |
| 1360.0 | 18.919 |
| 1359.0 | 19.719 |
| 1358.0 | 20.578 |
| 1357.0 | 21.456 |
| 1356.0 | 22.457 |
| 1355.0 | 23.503 |
| 1354.0 | 24.619 |
| 1353.0 | 25.779 |
| 1352.0 | 27.055 |
| 1351.0 | 28.323 |
| 1350.0 | 29.697 |
| 1349.0 | 31.133 |
| 1348.0 | 32.575 |
| 1347.0 | 34.187 |
| 1346.0 | 35.825 |
| 1345.0 | 37.451 |
| 1344.0 | 39.144 |
| 1343.0 | 40.798 |
| 1342.0 | 42.382 |
| 1341.0 | 43.901 |
| 1340.0 | 45.356 |
| 1339.0 | 46.661 |
| 1338.0 | 47.716 |
| 1337.0 | 48.565 |
| 1336.0 | 49.143 |
| 1335.0 | 49.461 |
| 1334.0 | 49.536 |
| 1333.0 | 49.338 |
| 1332.0 | 48.857 |
| 1331.0 | 48.125 |
| 1330.0 | 47.162 |
| 1329.0 | 46.071 |
| 1328.0 | 44.809 |
| 1327.0 | 43.407 |
| 1326.0 | 41.962 |
| 1325.0 | 40.445 |
| 1324.0 | 38.929 |
| 1323.0 | 37.403 |
| 1322.0 | 35.892 |
| 1321.0 | 34.344 |
| 1320.0 | 32.85 |
| 1319.0 | 31.516 |
| 1318.0 | 30.185 |
| 1317.0 | 28.943 |
| 1316.0 | 27.77 |
| 1315.0 | 26.636 |
| 1314.0 | 25.613 |
| 1313.0 | 24.682 |
| 1312.0 | 23.825 |
| 1311.0 | 23.016 |
| 1310.0 | 22.303 |
| 1309.0 | 21.631 |
| 1308.0 | 20.995 |
| 1307.0 | 20.426 |
| 1306.0 | 19.904 |
| 1305.0 | 19.43 |
| 1304.0 | 18.993 |
| 1303.0 | 18.605 |
| 1302.0 | 18.254 |
| 1301.0 | 17.969 |
| 1300.0 | 17.741 |
| 1299.0 | 17.552 |
| 1298.0 | 17.421 |
| 1297.0 | 17.328 |
| 1296.0 | 17.275 |
| 1295.0 | 17.257 |
| 1294.0 | 17.282 |
| 1293.0 | 17.341 |
| 1292.0 | 17.437 |
| 1291.0 | 17.567 |
| 1290.0 | 17.752 |
| 1289.0 | 17.988 |
| 1288.0 | 18.263 |
| 1287.0 | 18.587 |
| 1286.0 | 18.96 |
| 1285.0 | 19.386 |
| 1284.0 | 19.839 |
| 1283.0 | 20.366 |
| 1282.0 | 20.936 |
| 1281.0 | 21.521 |
| 1280.0 | 22.181 |
| 1279.0 | 22.868 |
| 1278.0 | 23.597 |
| 1277.0 | 24.369 |
| 1276.0 | 25.177 |
| 1275.0 | 25.987 |
| 1274.0 | 26.77 |
| 1273.0 | 27.575 |
| 1272.0 | 28.332 |
| 1271.0 | 29.053 |
| 1270.0 | 29.736 |
| 1269.0 | 30.321 |
| 1268.0 | 30.792 |
| 1267.0 | 31.151 |
| 1266.0 | 31.396 |
| 1265.0 | 31.506 |
| 1264.0 | 31.491 |
| 1263.0 | 31.367 |
| 1262.0 | 31.152 |
| 1261.0 | 30.842 |
| 1260.0 | 30.466 |
| 1259.0 | 30.028 |
| 1258.0 | 29.526 |
| 1257.0 | 28.979 |
| 1256.0 | 28.409 |
| 1255.0 | 27.868 |
| 1254.0 | 27.325 |
| 1253.0 | 26.835 |
| 1252.0 | 26.409 |
| 1251.0 | 26.061 |
| 1250.0 | 25.825 |
| 1249.0 | 25.709 |
| 1248.0 | 25.728 |
| 1247.0 | 25.896 |
| 1246.0 | 26.233 |
| 1245.0 | 26.805 |
| 1244.0 | 27.634 |
| 1243.0 | 28.71 |
| 1242.0 | 30.155 |
| 1241.0 | 31.946 |
| 1240.0 | 34.088 |
| 1239.0 | 36.488 |
| 1238.0 | 38.973 |
| 1237.0 | 41.029 |
| 1236.0 | 42.113 |
| 1235.0 | 41.833 |
| 1234.0 | 39.896 |
| 1233.0 | 36.464 |
| 1232.0 | 31.748 |
| 1231.0 | 26.617 |
| 1230.0 | 21.62 |
| 1229.0 | 17.116 |
| 1228.0 | 13.225 |
| 1227.0 | 10.168 |
| 1226.0 | 7.67 |
| 1225.0 | 5.787 |
| 1224.0 | 4.432 |
| 1223.0 | 3.403 |
| 1222.0 | 2.642 |
| 1221.0 | 2.065 |
| 1220.0 | 1.636 |
| 1219.0 | 1.296 |
| 1218.0 | 1.038 |
| 1217.0 | 0.85 |
| 1216.0 | 0.694 |
| 1215.0 | 0.571 |
| 1214.0 | 0.473 |
| 1213.0 | 0.396 |
| 1212.0 | 0.329 |
| 1211.0 | 0.281 |
| 1210.0 | 0.241 |
| 1209.0 | 0.203 |
| 1208.0 | 0.179 |
| 1207.0 | 0.152 |
| 1206.0 | 0.132 |
| 1205.0 | 0.116 |
| 1204.0 | 0.105 |
| 1203.0 | 0.093 |
| 1202.0 | 0.082 |
| 1201.0 | 0.074 |
| 1200.0 | 0.065 |
| 1199.0 | 0.065 |
| 1198.0 | 0.059 |
| 1197.0 | 0.052 |
| 1196.0 | 0.047 |
| 1195.0 | 0.044 |
| 1194.0 | 0.04 |
| 1193.0 | 0.035 |
| 1192.0 | 0.034 |
| 1191.0 | 0.031 |
| 1190.0 | 0.029 |
| 1189.0 | 0.028 |
| 1188.0 | 0.028 |
| 1187.0 | 0.021 |
| 1186.0 | 0.024 |
| 1185.0 | 0.024 |
| 1184.0 | 0.021 |
| 1183.0 | 0.023 |
| 1182.0 | 0.021 |
| 1181.0 | 0.021 |
| 1180.0 | 0.02 |
| 1179.0 | 0.018 |
| 1178.0 | 0.017 |
| 1177.0 | 0.018 |
| 1176.0 | 0.017 |
| 1175.0 | 0.017 |
| 1174.0 | 0.017 |
| 1173.0 | 0.017 |
| 1172.0 | 0.015 |
| 1171.0 | 0.014 |
| 1170.0 | 0.015 |
| 1169.0 | 0.016 |
| 1168.0 | 0.015 |
| 1167.0 | 0.014 |
| 1166.0 | 0.016 |
| 1165.0 | 0.016 |
| 1164.0 | 0.013 |
| 1163.0 | 0.013 |
| 1162.0 | 0.012 |
| 1161.0 | 0.015 |
| 1160.0 | 0.015 |
| 1159.0 | 0.014 |
| 1158.0 | 0.015 |
| 1157.0 | 0.013 |
| 1156.0 | 0.014 |
| 1155.0 | 0.016 |
| 1154.0 | 0.016 |
| 1153.0 | 0.014 |
| 1152.0 | 0.014 |
| 1151.0 | 0.014 |
| 1150.0 | 0.012 |
| 1149.0 | 0.014 |
| 1148.0 | 0.015 |
| 1147.0 | 0.015 |
| 1146.0 | 0.013 |
| 1145.0 | 0.016 |
| 1144.0 | 0.015 |
| 1143.0 | 0.012 |
| 1142.0 | 0.016 |
| 1141.0 | 0.014 |
| 1140.0 | 0.013 |
| 1139.0 | 0.013 |
| 1138.0 | 0.012 |
| 1137.0 | 0.014 |
| 1136.0 | 0.012 |
| 1135.0 | 0.011 |
| 1134.0 | 0.015 |
| 1133.0 | 0.011 |
| 1132.0 | 0.014 |
| 1131.0 | 0.015 |
| 1130.0 | 0.014 |
| 1129.0 | 0.012 |
| 1128.0 | 0.013 |
| 1127.0 | 0.015 |
| 1126.0 | 0.014 |
| 1125.0 | 0.014 |
| 1124.0 | 0.012 |
| 1123.0 | 0.011 |
| 1122.0 | 0.014 |
| 1121.0 | 0.012 |
| 1120.0 | 0.015 |
| 1119.0 | 0.013 |
| 1118.0 | 0.013 |
| 1117.0 | 0.011 |
| 1116.0 | 0.014 |
| 1115.0 | 0.013 |
| 1114.0 | 0.014 |
| 1113.0 | 0.013 |
| 1112.0 | 0.014 |
| 1111.0 | 0.014 |
| 1110.0 | 0.015 |
| 1109.0 | 0.014 |
| 1108.0 | 0.015 |
| 1107.0 | 0.011 |
| 1106.0 | 0.014 |
| 1105.0 | 0.011 |
| 1104.0 | 0.015 |
| 1103.0 | 0.013 |
| 1102.0 | 0.015 |
| 1101.0 | 0.011 |
| 1100.0 | 0.013 |
| 1099.0 | 0.015 |
| 1098.0 | 0.013 |
| 1097.0 | 0.015 |
| 1096.0 | 0.015 |
| 1095.0 | 0.013 |
| 1094.0 | 0.014 |
| 1093.0 | 0.016 |
| 1092.0 | 0.017 |
| 1091.0 | 0.013 |
| 1090.0 | 0.014 |
| 1089.0 | 0.013 |
| 1088.0 | 0.013 |
| 1087.0 | 0.016 |
| 1086.0 | 0.014 |
| 1085.0 | 0.011 |
| 1084.0 | 0.014 |
| 1083.0 | 0.013 |
| 1082.0 | 0.015 |
| 1081.0 | 0.014 |
| 1080.0 | 0.014 |
| 1079.0 | 0.013 |
| 1078.0 | 0.015 |
| 1077.0 | 0.012 |
| 1076.0 | 0.015 |
| 1075.0 | 0.014 |
| 1074.0 | 0.013 |
| 1073.0 | 0.013 |
| 1072.0 | 0.014 |
| 1071.0 | 0.015 |
| 1070.0 | 0.01 |
| 1069.0 | 0.016 |
| 1068.0 | 0.011 |
| 1067.0 | 0.013 |
| 1066.0 | 0.011 |
| 1065.0 | 0.014 |
| 1064.0 | 0.014 |
| 1063.0 | 0.013 |
| 1062.0 | 0.013 |
| 1061.0 | 0.012 |
| 1060.0 | 0.013 |
| 1059.0 | 0.014 |
| 1058.0 | 0.013 |
| 1057.0 | 0.013 |
| 1056.0 | 0.015 |
| 1055.0 | 0.013 |
| 1054.0 | 0.012 |
| 1053.0 | 0.013 |
| 1052.0 | 0.012 |
| 1051.0 | 0.01 |
| 1050.0 | 0.016 |
| 1049.0 | 0.012 |
| 1048.0 | 0.014 |
| 1047.0 | 0.012 |
| 1046.0 | 0.014 |
| 1045.0 | 0.016 |
| 1044.0 | 0.014 |
| 1043.0 | 0.013 |
| 1042.0 | 0.011 |
| 1041.0 | 0.013 |
| 1040.0 | 0.015 |
| 1039.0 | 0.013 |
| 1038.0 | 0.013 |
| 1037.0 | 0.013 |
| 1036.0 | 0.014 |
| 1035.0 | 0.013 |
| 1034.0 | 0.01 |
| 1033.0 | 0.012 |
| 1032.0 | 0.013 |
| 1031.0 | 0.013 |
| 1030.0 | 0.014 |
| 1029.0 | 0.016 |
| 1028.0 | 0.014 |
| 1027.0 | 0.014 |
| 1026.0 | 0.012 |
| 1025.0 | 0.012 |
| 1024.0 | 0.013 |
| 1023.0 | 0.013 |
| 1022.0 | 0.014 |
| 1021.0 | 0.012 |
| 1020.0 | 0.013 |
| 1019.0 | 0.012 |
| 1018.0 | 0.012 |
| 1017.0 | 0.015 |
| 1016.0 | 0.013 |
| 1015.0 | 0.014 |
| 1014.0 | 0.012 |
| 1013.0 | 0.013 |
| 1012.0 | 0.013 |
| 1011.0 | 0.012 |
| 1010.0 | 0.015 |
| 1009.0 | 0.013 |
| 1008.0 | 0.014 |
| 1007.0 | 0.011 |
| 1006.0 | 0.016 |
| 1005.0 | 0.012 |
| 1004.0 | 0.015 |
| 1003.0 | 0.013 |
| 1002.0 | 0.013 |
| 1001.0 | 0.012 |
| 1000.0 | 0.013 |
| 999.0 | 0.014 |
| 998.0 | 0.014 |
| 997.0 | 0.013 |
| 996.0 | 0.01 |
| 995.0 | 0.014 |
| 994.0 | 0.018 |
| 993.0 | 0.011 |
| 992.0 | 0.012 |
| 991.0 | 0.013 |
| 990.0 | 0.014 |
| 989.0 | 0.013 |
| 988.0 | 0.014 |
| 987.0 | 0.015 |
| 986.0 | 0.013 |
| 985.0 | 0.012 |
| 984.0 | 0.014 |
| 983.0 | 0.014 |
| 982.0 | 0.012 |
| 981.0 | 0.013 |
| 980.0 | 0.013 |
| 979.0 | 0.011 |
| 978.0 | 0.012 |
| 977.0 | 0.014 |
| 976.0 | 0.013 |
| 975.0 | 0.013 |
| 974.0 | 0.015 |
| 973.0 | 0.012 |
| 972.0 | 0.014 |
| 971.0 | 0.013 |
| 970.0 | 0.011 |
| 969.0 | 0.013 |
| 968.0 | 0.011 |
| 967.0 | 0.013 |
| 966.0 | 0.016 |
| 965.0 | 0.016 |
| 964.0 | 0.014 |
| 963.0 | 0.013 |
| 962.0 | 0.014 |
| 961.0 | 0.015 |
| 960.0 | 0.014 |
| 959.0 | 0.013 |
| 958.0 | 0.013 |
| 957.0 | 0.013 |
| 956.0 | 0.013 |
| 955.0 | 0.014 |
| 954.0 | 0.014 |
| 953.0 | 0.015 |
| 952.0 | 0.016 |
| 951.0 | 0.014 |
| 950.0 | 0.012 |
| 949.0 | 0.013 |
| 948.0 | 0.012 |
| 947.0 | 0.014 |
| 946.0 | 0.013 |
| 945.0 | 0.015 |
| 944.0 | 0.015 |
| 943.0 | 0.012 |
| 942.0 | 0.014 |
| 941.0 | 0.017 |
| 940.0 | 0.014 |
| 939.0 | 0.012 |
| 938.0 | 0.011 |
| 937.0 | 0.015 |
| 936.0 | 0.012 |
| 935.0 | 0.015 |
| 934.0 | 0.015 |
| 933.0 | 0.013 |
| 932.0 | 0.011 |
| 931.0 | 0.013 |
| 930.0 | 0.013 |
| 929.0 | 0.012 |
| 928.0 | 0.011 |
| 927.0 | 0.01 |
| 926.0 | 0.012 |
| 925.0 | 0.011 |
| 924.0 | 0.013 |
| 923.0 | 0.013 |
| 922.0 | 0.013 |
| 921.0 | 0.012 |
| 920.0 | 0.016 |
| 919.0 | 0.014 |
| 918.0 | 0.011 |
| 917.0 | 0.01 |
| 916.0 | 0.013 |
| 915.0 | 0.013 |
| 914.0 | 0.014 |
| 913.0 | 0.012 |
| 912.0 | 0.011 |
| 911.0 | 0.012 |
| 910.0 | 0.013 |
| 909.0 | 0.012 |
| 908.0 | 0.012 |
| 907.0 | 0.013 |
| 906.0 | 0.014 |
| 905.0 | 0.015 |
| 904.0 | 0.014 |
| 903.0 | 0.012 |
| 902.0 | 0.012 |
| 901.0 | 0.012 |
| 900.0 | 0.014 |
| 899.0 | 0.011 |
| 898.0 | 0.013 |
| 897.0 | 0.014 |
| 896.0 | 0.014 |
| 895.0 | 0.014 |
| 894.0 | 0.012 |
| 893.0 | 0.014 |
| 892.0 | 0.014 |
| 891.0 | 0.012 |
| 890.0 | 0.013 |
| 889.0 | 0.012 |
| 888.0 | 0.014 |
| 887.0 | 0.012 |
| 886.0 | 0.012 |
| 885.0 | 0.017 |
| 884.0 | 0.013 |
| 883.0 | 0.013 |
| 882.0 | 0.011 |
| 881.0 | 0.011 |
| 880.0 | 0.014 |
| 879.0 | 0.013 |
| 878.0 | 0.013 |
| 877.0 | 0.013 |
| 876.0 | 0.013 |
| 875.0 | 0.014 |
| 874.0 | 0.014 |
| 873.0 | 0.011 |
| 872.0 | 0.012 |
| 871.0 | 0.011 |
| 870.0 | 0.014 |
| 869.0 | 0.016 |
| 868.0 | 0.014 |
| 867.0 | 0.015 |
| 866.0 | 0.013 |
| 865.0 | 0.017 |
| 864.0 | 0.012 |
| 863.0 | 0.013 |
| 862.0 | 0.014 |
| 861.0 | 0.013 |
| 860.0 | 0.013 |
| 859.0 | 0.01 |
| 858.0 | 0.012 |
| 857.0 | 0.014 |
| 856.0 | 0.013 |
| 855.0 | 0.016 |
| 854.0 | 0.013 |
| 853.0 | 0.01 |
| 852.0 | 0.016 |
| 851.0 | 0.017 |
| 850.0 | 0.012 |
| 849.0 | 0.014 |
| 848.0 | 0.011 |
| 847.0 | 0.015 |
| 846.0 | 0.013 |
| 845.0 | 0.015 |
| 844.0 | 0.014 |
| 843.0 | 0.012 |
| 842.0 | 0.015 |
| 841.0 | 0.012 |
| 840.0 | 0.014 |
| 839.0 | 0.014 |
| 838.0 | 0.014 |
| 837.0 | 0.015 |
| 836.0 | 0.013 |
| 835.0 | 0.013 |
| 834.0 | 0.014 |
| 833.0 | 0.013 |
| 832.0 | 0.012 |
| 831.0 | 0.013 |
| 830.0 | 0.016 |
| 829.0 | 0.013 |
| 828.0 | 0.013 |
| 827.0 | 0.014 |
| 826.0 | 0.013 |
| 825.0 | 0.012 |
| 824.0 | 0.015 |
| 823.0 | 0.014 |
| 822.0 | 0.013 |
| 821.0 | 0.012 |
| 820.0 | 0.01 |
| 819.0 | 0.013 |
| 818.0 | 0.015 |
| 817.0 | 0.014 |
| 816.0 | 0.012 |
| 815.0 | 0.013 |
| 814.0 | 0.012 |
| 813.0 | 0.01 |
| 812.0 | 0.012 |
| 811.0 | 0.016 |
| 810.0 | 0.011 |
| 809.0 | 0.013 |
| 808.0 | 0.015 |
| 807.0 | 0.013 |
| 806.0 | 0.012 |
| 805.0 | 0.012 |
| 804.0 | 0.013 |
| 803.0 | 0.014 |
| 802.0 | 0.009 |
| 801.0 | 0.014 |
| 800.0 | 0.012 |
| 799.0 | 0 |
| 798.0 | 0 |
| 797.0 | 0 |
| 796.0 | 0 |
| 795.0 | 0 |
| 794.0 | 0 |
| 793.0 | 0 |
| 792.0 | 0 |
| 791.0 | 0 |
| 790.0 | 0 |
| 789.0 | 0 |
| 788.0 | 0 |
| 787.0 | 0 |
| 786.0 | 0 |
| 785.0 | 0 |
| 784.0 | 0 |
| 783.0 | 0 |
| 782.0 | 0 |
| 781.0 | 0 |
| 780.0 | 0 |
| 779.0 | 0 |
| 778.0 | 0 |
| 777.0 | 0 |
| 776.0 | 0 |
| 775.0 | 0 |
| 774.0 | 0 |
| 773.0 | 0 |
| 772.0 | 0 |
| 771.0 | 0 |
| 770.0 | 0 |
| 769.0 | 0 |
| 768.0 | 0 |
| 767.0 | 0 |
| 766.0 | 0 |
| 765.0 | 0 |
| 764.0 | 0 |
| 763.0 | 0 |
| 762.0 | 0 |
| 761.0 | 0 |
| 760.0 | 0 |
| 759.0 | 0 |
| 758.0 | 0 |
| 757.0 | 0 |
| 756.0 | 0 |
| 755.0 | 0 |
| 754.0 | 0 |
| 753.0 | 0 |
| 752.0 | 0 |
| 751.0 | 0 |
| 750.0 | 0 |
| 749.0 | 0 |
| 748.0 | 0 |
| 747.0 | 0 |
| 746.0 | 0 |
| 745.0 | 0 |
| 744.0 | 0 |
| 743.0 | 0 |
| 742.0 | 0.001 |
| 741.0 | 0 |
| 740.0 | 0 |
| 739.0 | 0 |
| 738.0 | 0.001 |
| 737.0 | 0 |
| 736.0 | 0.001 |
| 735.0 | 0.001 |
| 734.0 | 0.001 |
| 733.0 | 0 |
| 732.0 | 0.001 |
| 731.0 | 0.001 |
| 730.0 | 0 |
| 729.0 | 0.001 |
| 728.0 | 0.001 |
| 727.0 | 0.001 |
| 726.0 | 0.001 |
| 725.0 | 0.001 |
| 724.0 | 0.001 |
| 723.0 | 0.001 |
| 722.0 | 0.001 |
| 721.0 | 0.001 |
| 720.0 | 0.001 |
| 719.0 | 0.001 |
| 718.0 | 0.001 |
| 717.0 | 0.001 |
| 716.0 | 0.001 |
| 715.0 | 0.001 |
| 714.0 | 0.001 |
| 713.0 | 0.001 |
| 712.0 | 0.001 |
| 711.0 | 0.001 |
| 710.0 | 0.001 |
| 709.0 | 0.002 |
| 708.0 | 0.002 |
| 707.0 | 0.002 |
| 706.0 | 0.002 |
| 705.0 | 0.002 |
| 704.0 | 0.003 |
| 703.0 | 0.003 |
| 702.0 | 0.004 |
| 701.0 | 0.004 |
| 700.0 | 0.005 |
| 699.0 | 0.005 |
| 698.0 | 0.006 |
| 697.0 | 0.007 |
| 696.0 | 0.009 |
| 695.0 | 0.01 |
| 694.0 | 0.012 |
| 693.0 | 0.015 |
| 692.0 | 0.019 |
| 691.0 | 0.024 |
| 690.0 | 0.03 |
| 689.0 | 0.039 |
| 688.0 | 0.052 |
| 687.0 | 0.07 |
| 686.0 | 0.097 |
| 685.0 | 0.138 |
| 684.0 | 0.199 |
| 683.0 | 0.3 |
| 682.0 | 0.469 |
| 681.0 | 0.766 |
| 680.0 | 1.319 |
| 679.0 | 2.394 |
| 678.0 | 4.66 |
| 677.0 | 9.499 |
| 676.0 | 19.248 |
| 675.0 | 35.128 |
| 674.0 | 53.042 |
| 673.0 | 65.927 |
| 672.0 | 70.99 |
| 671.0 | 71.376 |
| 670.0 | 70.424 |
| 669.0 | 69.35 |
| 668.0 | 68.237 |
| 667.0 | 65.436 |
| 666.0 | 57.166 |
| 665.0 | 41.628 |
| 664.0 | 24.34 |
| 663.0 | 11.863 |
| 662.0 | 5.37 |
| 661.0 | 2.515 |
| 660.0 | 1.245 |
| 659.0 | 0.66 |
| 658.0 | 0.372 |
| 657.0 | 0.221 |
| 656.0 | 0.137 |
| 655.0 | 0.087 |
| 654.0 | 0.058 |
| 653.0 | 0.04 |
| 652.0 | 0.028 |
| 651.0 | 0.02 |
| 650.0 | 0.014 |
| 649.0 | 0.011 |
| 648.0 | 0.008 |
| 647.0 | 0.006 |
| 646.0 | 0.005 |
| 645.0 | 0.003 |
| 644.0 | 0.003 |
| 643.0 | 0.002 |
| 642.0 | 0.002 |
| 641.0 | 0.001 |
| 640.0 | 0.001 |
| 639.0 | 0.001 |
| 638.0 | 0.001 |
| 637.0 | 0 |
| 636.0 | 0.001 |
| 635.0 | 0 |
| 634.0 | 0 |
| 633.0 | 0 |
| 632.0 | 0 |
| 631.0 | 0 |
| 630.0 | 0 |
| 629.0 | 0 |
| 628.0 | 0 |
| 627.0 | 0 |
| 626.0 | 0 |
| 625.0 | 0 |
| 624.0 | 0 |
| 623.0 | 0 |
| 622.0 | 0 |
| 621.0 | 0 |
| 620.0 | 0 |
| 619.0 | 0 |
| 618.0 | 0 |
| 617.0 | 0 |
| 616.0 | 0 |
| 615.0 | 0 |
| 614.0 | 0 |
| 613.0 | 0 |
| 612.0 | 0 |
| 611.0 | 0 |
| 610.0 | 0 |
| 609.0 | 0 |
| 608.0 | 0 |
| 607.0 | 0 |
| 606.0 | 0 |
| 605.0 | 0 |
| 604.0 | 0 |
| 603.0 | 0 |
| 602.0 | 0 |
| 601.0 | 0 |
| 600.0 | 0 |
| 599.0 | 0 |
| 598.0 | 0 |
| 597.0 | 0 |
| 596.0 | 0 |
| 595.0 | 0 |
| 594.0 | 0 |
| 593.0 | 0 |
| 592.0 | 0 |
| 591.0 | 0 |
| 590.0 | 0 |
| 589.0 | 0 |
| 588.0 | 0 |
| 587.0 | 0 |
| 586.0 | 0 |
| 585.0 | 0 |
| 584.0 | 0 |
| 583.0 | 0 |
| 582.0 | 0 |
| 581.0 | 0 |
| 580.0 | 0 |
| 579.0 | 0 |
| 578.0 | 0 |
| 577.0 | 0 |
| 576.0 | 0 |
| 575.0 | 0 |
| 574.0 | 0 |
| 573.0 | 0 |
| 572.0 | 0 |
| 571.0 | 0 |
| 570.0 | 0 |
| 569.0 | 0 |
| 568.0 | 0 |
| 567.0 | 0 |
| 566.0 | 0 |
| 565.0 | 0 |
| 564.0 | 0 |
| 563.0 | 0 |
| 562.0 | 0 |
| 561.0 | 0 |
| 560.0 | 0 |
| 559.0 | 0 |
| 558.0 | 0 |
| 557.0 | 0 |
| 556.0 | 0 |
| 555.0 | 0 |
| 554.0 | 0 |
| 553.0 | 0 |
| 552.0 | 0 |
| 551.0 | 0 |
| 550.0 | 0 |
| 549.0 | 0 |
| 548.0 | 0 |
| 547.0 | 0 |
| 546.0 | 0 |
| 545.0 | 0 |
| 544.0 | 0 |
| 543.0 | 0 |
| 542.0 | 0 |
| 541.0 | 0 |
| 540.0 | 0 |
| 539.0 | 0 |
| 538.0 | 0 |
| 537.0 | 0 |
| 536.0 | 0 |
| 535.0 | 0 |
| 534.0 | 0 |
| 533.0 | 0 |
| 532.0 | 0 |
| 531.0 | 0 |
| 530.0 | 0 |
| 529.0 | 0 |
| 528.0 | 0 |
| 527.0 | 0 |
| 526.0 | 0 |
| 525.0 | 0 |
| 524.0 | 0 |
| 523.0 | 0 |
| 522.0 | 0 |
| 521.0 | 0 |
| 520.0 | 0 |
| 519.0 | 0 |
| 518.0 | 0 |
| 517.0 | 0 |
| 516.0 | 0 |
| 515.0 | 0 |
| 514.0 | 0 |
| 513.0 | 0 |
| 512.0 | 0 |
| 511.0 | 0 |
| 510.0 | 0 |
| 509.0 | 0 |
| 508.0 | 0 |
| 507.0 | 0 |
| 506.0 | 0 |
| 505.0 | 0 |
| 504.0 | 0 |
| 503.0 | 0 |
| 502.0 | 0 |
| 501.0 | 0 |
| 500.0 | 0 |
| 499.0 | 0 |
| 498.0 | 0 |
| 497.0 | 0 |
| 496.0 | 0 |
| 495.0 | 0 |
| 494.0 | 0 |
| 493.0 | 0 |
| 492.0 | 0 |
| 491.0 | 0 |
| 490.0 | 0 |
| 489.0 | 0 |
| 488.0 | 0 |
| 487.0 | 0 |
| 486.0 | 0 |
| 485.0 | 0 |
| 484.0 | 0 |
| 483.0 | 0 |
| 482.0 | 0 |
| 481.0 | 0 |
| 480.0 | 0 |
| 479.0 | 0 |
| 478.0 | 0 |
| 477.0 | 0 |
| 476.0 | 0 |
| 475.0 | 0 |
| 474.0 | 0 |
| 473.0 | 0 |
| 472.0 | 0 |
| 471.0 | 0 |
| 470.0 | 0 |
| 469.0 | 0 |
| 468.0 | 0 |
| 467.0 | 0 |
| 466.0 | 0 |
| 465.0 | 0 |
| 464.0 | 0 |
| 463.0 | 0 |
| 462.0 | 0 |
| 461.0 | 0 |
| 460.0 | 0 |
| 459.0 | 0 |
| 458.0 | 0 |
| 457.0 | 0 |
| 456.0 | 0 |
| 455.0 | 0 |
| 454.0 | 0 |
| 453.0 | 0 |
| 452.0 | 0 |
| 451.0 | 0 |
| 450.0 | 0 |
| 449.0 | 0 |
| 448.0 | 0 |
| 447.0 | 0 |
| 446.0 | 0 |
| 445.0 | 0 |
| 444.0 | 0 |
| 443.0 | 0 |
| 442.0 | 0 |
| 441.0 | 0 |
| 440.0 | 0 |
| 439.0 | 0 |
| 438.0 | 0 |
| 437.0 | 0 |
| 436.0 | 0 |
| 435.0 | 0 |
| 434.0 | 0 |
| 433.0 | 0 |
| 432.0 | 0 |
| 431.0 | 0 |
| 430.0 | 0 |
| 429.0 | 0 |
| 428.0 | 0 |
| 427.0 | 0 |
| 426.0 | 0 |
| 425.0 | 0 |
| 424.0 | 0 |
| 423.0 | 0 |
| 422.0 | 0 |
| 421.0 | 0 |
| 420.0 | 0 |
| 419.0 | 0 |
| 418.0 | 0 |
| 417.0 | 0 |
| 416.0 | 0 |
| 415.0 | 0 |
| 414.0 | 0 |
| 413.0 | 0 |
| 412.0 | 0 |
| 411.0 | 0 |
| 410.0 | 0 |
| 409.0 | 0 |
| 408.0 | 0 |
| 407.0 | 0 |
| 406.0 | 0 |
| 405.0 | 0 |
| 404.0 | 0 |
| 403.0 | 0 |
| 402.0 | 0 |
| 401.0 | 0 |
| 400.0 | 0 |
| 399.0 | 0 |
| 398.0 | 0 |
| 397.0 | 0 |
| 396.0 | 0 |
| 395.0 | 0 |
| 394.0 | 0 |
| 393.0 | 0 |
| 392.0 | 0 |
| 391.0 | 0 |
| 390.0 | 0 |
| 389.0 | 0 |
| 388.0 | 0 |
| 387.0 | 0 |
| 386.0 | 0 |
| 385.0 | 0 |
| 384.0 | 0 |
| 383.0 | 0 |
| 382.0 | 0 |
| 381.0 | 0 |
| 380.0 | 0 |
| 379.0 | 0 |
| 378.0 | 0 |
| 377.0 | 0 |
| 376.0 | 0 |
| 375.0 | 0 |
| 374.0 | 0 |
| 373.0 | 0 |
| 372.0 | 0 |
| 371.0 | 0 |
| 370.0 | 0 |
| 369.0 | 0 |
| 368.0 | 0 |
| 367.0 | 0 |
| 366.0 | 0 |
| 365.0 | 0 |
| 364.0 | 0 |
| 363.0 | 0 |
| 362.0 | 0 |
| 361.0 | 0 |
| 360.0 | 0 |
| 359.0 | 0 |
| 358.0 | 0 |
| 357.0 | 0 |
| 356.0 | 0 |
| 355.0 | 0 |
| 354.0 | 0 |
| 353.0 | 0 |
| 352.0 | 0 |
| 351.0 | 0 |
| 350.0 | 0 |
| 349.0 | 0.001 |
| 348.0 | 0 |
| 347.0 | 0 |
| 346.0 | 0 |
| 345.0 | 0 |
| 344.0 | 0 |
| 343.0 | 0 |
| 342.0 | 0 |
| 341.0 | 0 |
| 340.0 | 0 |
| 339.0 | 0 |
| 338.0 | 0 |
| 337.0 | 0 |
| 336.0 | 0 |
| 335.0 | 0 |
| 334.0 | 0 |
| 333.0 | 0 |
| 332.0 | 0 |
| 331.0 | 0 |
| 330.0 | 0 |
| 329.0 | 0 |
| 328.0 | 0 |
| 327.0 | 0 |
| 326.0 | 0 |
| 325.0 | 0 |
| 324.0 | 0 |
| 323.0 | 0 |
| 322.0 | 0 |
| 321.0 | 0 |
| 320.0 | 0 |
| 319.0 | 0 |
| 318.0 | 0 |
| 317.0 | 0 |
| 316.0 | 0 |
| 315.0 | 0 |
| 314.0 | 0 |
| 313.0 | 0 |
| 312.0 | 0 |
| 311.0 | 0 |
| 310.0 | 0 |
| 309.0 | 0 |
| 308.0 | 0 |
| 307.0 | 0 |
| 306.0 | 0 |
| 305.0 | 0 |
| 304.0 | 0 |
| 303.0 | 0 |
| 302.0 | 0 |
| 301.0 | 0 |
| 300.0 | 0 |
| 299.0 | 0 |
| 298.0 | 0 |
| 297.0 | 0 |
| 296.0 | 0 |
| 295.0 | 0 |
| 294.0 | 0 |
| 293.0 | 0 |
| 292.0 | 0 |
| 291.0 | 0 |
| 290.0 | 0 |
| 289.0 | 0 |
| 288.0 | 0 |
| 287.0 | 0 |
| 286.0 | 0 |
| 285.0 | 0 |
| 284.0 | 0 |
| 283.0 | 0 |
| 282.0 | 0 |
| 281.0 | 0 |
| 280.0 | 0 |
| 279.0 | 0 |
| 278.0 | 0 |
| 277.0 | 0 |
| 276.0 | 0 |
| 275.0 | 0 |
| 274.0 | 0 |
| 273.0 | 0 |
| 272.0 | 0 |
| 271.0 | 0 |
| 270.0 | 0 |
| 269.0 | 0 |
| 268.0 | 0 |
| 267.0 | 0 |
| 266.0 | 0 |
| 265.0 | 0 |
| 264.0 | 0 |
| 263.0 | 0 |
| 262.0 | 0 |
| 261.0 | 0 |
| 260.0 | 0 |
| 259.0 | 0 |
| 258.0 | 0 |
| 257.0 | 0 |
| 256.0 | 0 |
| 255.0 | 0 |
| 254.0 | 0 |
| 253.0 | 0 |
| 252.0 | 0 |
| 251.0 | 0 |
| 250.0 | 0 |
| 249.0 | 0 |
| 248.0 | 0 |
| 247.0 | 0 |
| 246.0 | 0 |
| 245.0 | 0 |
| 244.0 | 0 |
| 243.0 | 0 |
| 242.0 | 0 |
| 241.0 | 0 |
| 240.0 | 0 |
| 239.0 | 0 |
| 238.0 | 0 |
| 237.0 | 0 |
| 236.0 | 0 |
| 235.0 | 0 |
| 234.0 | 0 |
| 233.0 | 0 |
| 232.0 | 0 |
| 231.0 | 0 |
| 230.0 | 0 |
| 229.0 | 0 |
| 228.0 | 0 |
| 227.0 | 0 |
| 226.0 | 0 |
| 225.0 | 0 |
| 224.0 | 0 |
| 223.0 | 0 |
| 222.0 | 0 |
| 221.0 | 0 |
| 220.0 | 0 |
| 219.0 | 0 |
| 218.0 | 0 |
| 217.0 | 0 |
| 216.0 | 0 |
| 215.0 | 0 |
| 214.0 | 0 |
| 213.0 | 0 |
| 212.0 | 0 |
| 211.0 | 0 |
| 210.0 | 0 |
| 209.0 | 0 |
| 208.0 | 0 |
| 207.0 | 0 |
| 206.0 | 0 |
| 205.0 | 0 |
| 204.0 | 0 |
| 203.0 | 0 |
| 202.0 | 0 |
| 201.0 | 0 |